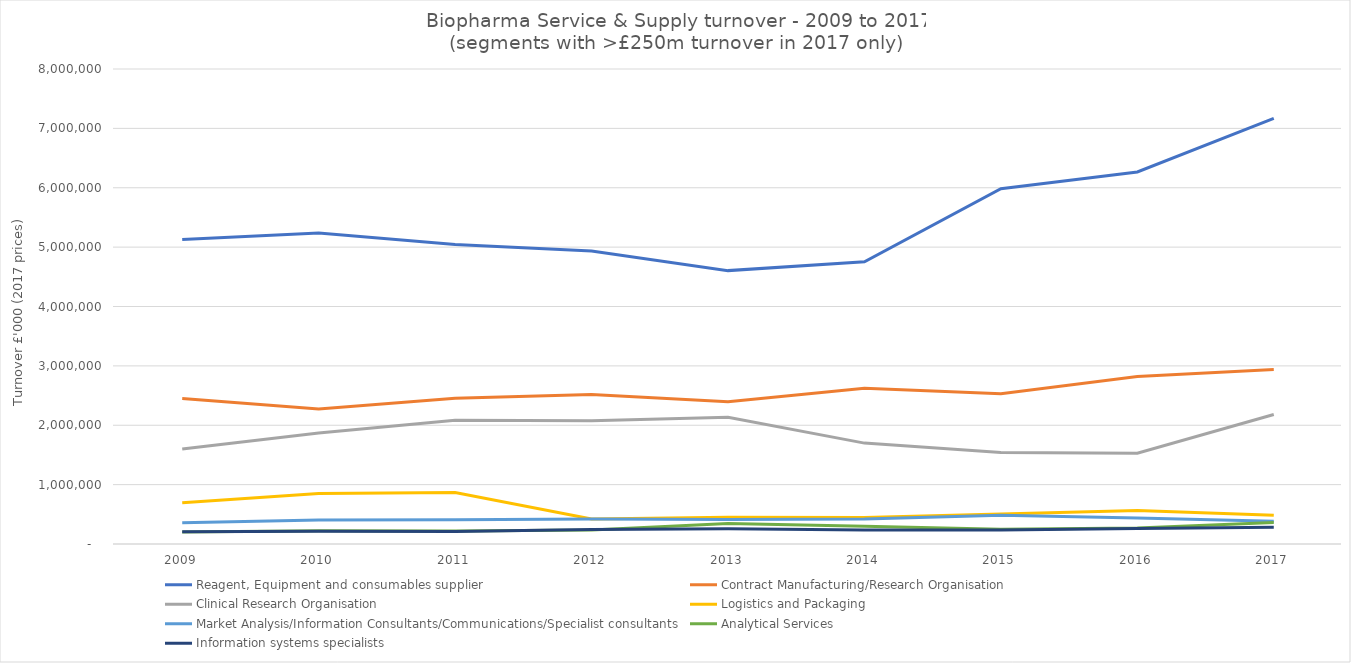
| Category | Reagent, Equipment and consumables supplier | Contract Manufacturing/Research Organisation | Clinical Research Organisation | Logistics and Packaging | Market Analysis/Information Consultants/Communications/Specialist consultants | Analytical Services | Information systems specialists |
|---|---|---|---|---|---|---|---|
| 2009 | 5130177 | 2450542 | 1599965 | 695120 | 358619 | 200165 | 205400 |
| 2010 | 5236555 | 2274156 | 1869982 | 850927 | 403874 | 224805 | 216207 |
| 2011 | 5044355 | 2453772 | 2082756 | 865920 | 406742 | 220863 | 210844 |
| 2012 | 4936019 | 2515986 | 2077614 | 420582 | 420262 | 235661 | 244468 |
| 2013 | 4604314 | 2397152 | 2133310 | 452580 | 411197 | 343223 | 255932 |
| 2014 | 4752974 | 2623671 | 1699043 | 445855 | 421718 | 298456 | 235390 |
| 2015 | 5982404 | 2532529 | 1540909 | 505131 | 484994 | 249923 | 234293 |
| 2016 | 6265939 | 2820429 | 1527339 | 564113 | 436882 | 270204 | 259032 |
| 2017 | 7168618 | 2937415 | 2182017 | 486061 | 383675 | 361616 | 283610 |